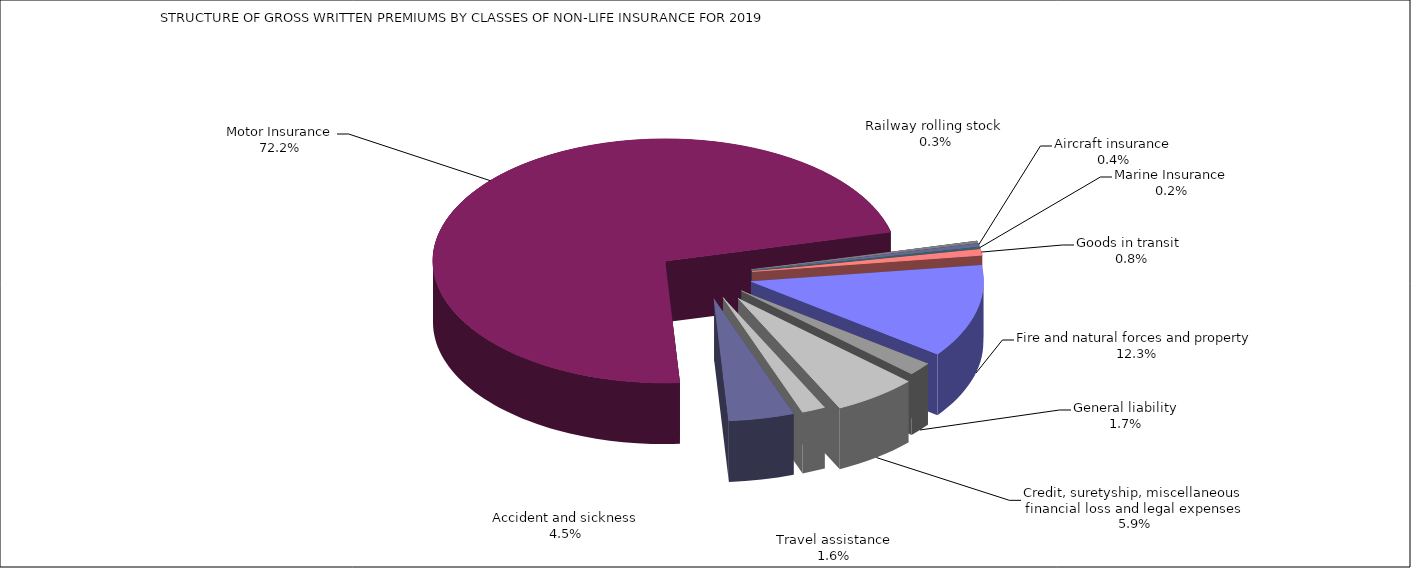
| Category | Series 0 |
|---|---|
| Accident and sickness | 0.045 |
| Motor Insurance | 0.722 |
| Railway rolling stock  | 0.003 |
| Aircraft insurance | 0.004 |
| Marine Insurance | 0.002 |
| Goods in transit  | 0.008 |
| Fire and natural forces and property | 0.123 |
| General liability | 0.017 |
| Credit, suretyship, miscellaneous financial loss and legal expenses | 0.059 |
| Travel assistance | 0.016 |